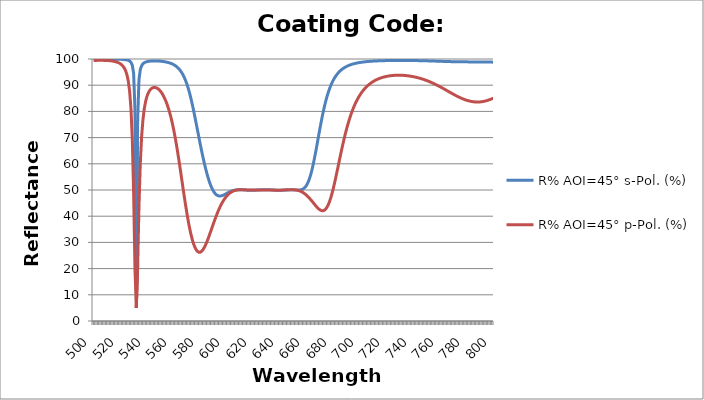
| Category | R% AOI=45° s-Pol. (%) | R% AOI=45° p-Pol. (%) |
|---|---|---|
| 500.0 | 99.98 | 99.407 |
| 501.0 | 99.98 | 99.441 |
| 502.0 | 99.98 | 99.465 |
| 503.0 | 99.98 | 99.482 |
| 504.0 | 99.98 | 99.492 |
| 505.0 | 99.98 | 99.496 |
| 506.0 | 99.979 | 99.494 |
| 507.0 | 99.978 | 99.486 |
| 508.0 | 99.977 | 99.472 |
| 509.0 | 99.976 | 99.451 |
| 510.0 | 99.974 | 99.423 |
| 511.0 | 99.972 | 99.387 |
| 512.0 | 99.969 | 99.341 |
| 513.0 | 99.966 | 99.284 |
| 514.0 | 99.962 | 99.212 |
| 515.0 | 99.957 | 99.125 |
| 516.0 | 99.95 | 99.015 |
| 517.0 | 99.943 | 98.878 |
| 518.0 | 99.933 | 98.703 |
| 519.0 | 99.92 | 98.478 |
| 520.0 | 99.904 | 98.183 |
| 521.0 | 99.881 | 97.793 |
| 522.0 | 99.85 | 97.262 |
| 523.0 | 99.807 | 96.526 |
| 524.0 | 99.744 | 95.472 |
| 525.0 | 99.648 | 93.913 |
| 526.0 | 99.494 | 91.51 |
| 527.0 | 99.229 | 87.63 |
| 528.0 | 98.724 | 81.036 |
| 529.0 | 97.606 | 69.329 |
| 530.0 | 94.458 | 48.786 |
| 531.0 | 80.641 | 20.008 |
| 532.0 | 15.789 | 4.939 |
| 533.0 | 76.487 | 20.531 |
| 534.0 | 92.083 | 43.625 |
| 535.0 | 95.959 | 60.15 |
| 536.0 | 97.449 | 70.452 |
| 537.0 | 98.175 | 76.892 |
| 538.0 | 98.581 | 81.054 |
| 539.0 | 98.83 | 83.834 |
| 540.0 | 98.991 | 85.737 |
| 541.0 | 99.098 | 87.055 |
| 542.0 | 99.17 | 87.963 |
| 543.0 | 99.218 | 88.568 |
| 544.0 | 99.247 | 88.94 |
| 545.0 | 99.262 | 89.122 |
| 546.0 | 99.265 | 89.141 |
| 547.0 | 99.256 | 89.013 |
| 548.0 | 99.238 | 88.747 |
| 549.0 | 99.209 | 88.345 |
| 550.0 | 99.169 | 87.805 |
| 551.0 | 99.118 | 87.119 |
| 552.0 | 99.054 | 86.279 |
| 553.0 | 98.976 | 85.271 |
| 554.0 | 98.886 | 84.141 |
| 555.0 | 98.78 | 82.847 |
| 556.0 | 98.654 | 81.359 |
| 557.0 | 98.503 | 79.661 |
| 558.0 | 98.324 | 77.739 |
| 559.0 | 98.11 | 75.581 |
| 560.0 | 97.855 | 73.183 |
| 561.0 | 97.55 | 70.544 |
| 562.0 | 97.187 | 67.674 |
| 563.0 | 96.753 | 64.594 |
| 564.0 | 96.234 | 61.336 |
| 565.0 | 95.616 | 57.944 |
| 566.0 | 94.881 | 54.472 |
| 567.0 | 94.009 | 50.983 |
| 568.0 | 92.982 | 47.542 |
| 569.0 | 91.779 | 44.215 |
| 570.0 | 90.384 | 41.063 |
| 571.0 | 88.784 | 38.139 |
| 572.0 | 86.974 | 35.488 |
| 573.0 | 84.959 | 33.143 |
| 574.0 | 82.753 | 31.126 |
| 575.0 | 80.384 | 29.454 |
| 576.0 | 77.887 | 28.133 |
| 577.0 | 75.305 | 27.163 |
| 578.0 | 72.684 | 26.539 |
| 579.0 | 70.068 | 26.25 |
| 580.0 | 67.495 | 26.278 |
| 581.0 | 65 | 26.602 |
| 582.0 | 62.611 | 27.193 |
| 583.0 | 60.349 | 28.021 |
| 584.0 | 58.234 | 29.049 |
| 585.0 | 56.284 | 30.239 |
| 586.0 | 54.513 | 31.553 |
| 587.0 | 52.938 | 32.953 |
| 588.0 | 51.568 | 34.403 |
| 589.0 | 50.413 | 35.869 |
| 590.0 | 49.475 | 37.324 |
| 591.0 | 48.751 | 38.742 |
| 592.0 | 48.231 | 40.103 |
| 593.0 | 47.898 | 41.391 |
| 594.0 | 47.731 | 42.594 |
| 595.0 | 47.704 | 43.705 |
| 596.0 | 47.791 | 44.718 |
| 597.0 | 47.963 | 45.631 |
| 598.0 | 48.194 | 46.443 |
| 599.0 | 48.46 | 47.158 |
| 600.0 | 48.74 | 47.778 |
| 601.0 | 49.017 | 48.308 |
| 602.0 | 49.274 | 48.752 |
| 603.0 | 49.494 | 49.114 |
| 604.0 | 49.681 | 49.406 |
| 605.0 | 49.832 | 49.636 |
| 606.0 | 49.948 | 49.811 |
| 607.0 | 50.029 | 49.938 |
| 608.0 | 50.078 | 50.024 |
| 609.0 | 50.099 | 50.077 |
| 610.0 | 50.098 | 50.104 |
| 611.0 | 50.079 | 50.11 |
| 612.0 | 50.048 | 50.102 |
| 613.0 | 50.012 | 50.084 |
| 614.0 | 49.975 | 50.061 |
| 615.0 | 49.941 | 50.038 |
| 616.0 | 49.913 | 50.015 |
| 617.0 | 49.895 | 49.997 |
| 618.0 | 49.887 | 49.983 |
| 619.0 | 49.89 | 49.975 |
| 620.0 | 49.902 | 49.972 |
| 621.0 | 49.923 | 49.974 |
| 622.0 | 49.951 | 49.979 |
| 623.0 | 49.982 | 49.987 |
| 624.0 | 50.014 | 49.996 |
| 625.0 | 50.045 | 50.005 |
| 626.0 | 50.071 | 50.012 |
| 627.0 | 50.092 | 50.017 |
| 628.0 | 50.105 | 50.018 |
| 629.0 | 50.109 | 50.016 |
| 630.0 | 50.105 | 50.009 |
| 631.0 | 50.093 | 49.999 |
| 632.0 | 50.074 | 49.987 |
| 633.0 | 50.05 | 49.974 |
| 634.0 | 50.023 | 49.96 |
| 635.0 | 49.995 | 49.947 |
| 636.0 | 49.969 | 49.936 |
| 637.0 | 49.946 | 49.928 |
| 638.0 | 49.93 | 49.925 |
| 639.0 | 49.92 | 49.928 |
| 640.0 | 49.918 | 49.937 |
| 641.0 | 49.926 | 49.953 |
| 642.0 | 49.94 | 49.975 |
| 643.0 | 49.961 | 50.002 |
| 644.0 | 49.985 | 50.032 |
| 645.0 | 50.01 | 50.064 |
| 646.0 | 50.033 | 50.094 |
| 647.0 | 50.05 | 50.119 |
| 648.0 | 50.059 | 50.135 |
| 649.0 | 50.057 | 50.137 |
| 650.0 | 50.044 | 50.12 |
| 651.0 | 50.024 | 50.08 |
| 652.0 | 49.999 | 50.012 |
| 653.0 | 49.981 | 49.908 |
| 654.0 | 49.982 | 49.766 |
| 655.0 | 50.023 | 49.581 |
| 656.0 | 50.131 | 49.347 |
| 657.0 | 50.338 | 49.063 |
| 658.0 | 50.685 | 48.724 |
| 659.0 | 51.216 | 48.33 |
| 660.0 | 51.977 | 47.881 |
| 661.0 | 53.014 | 47.379 |
| 662.0 | 54.347 | 46.841 |
| 663.0 | 56 | 46.267 |
| 664.0 | 57.976 | 45.661 |
| 665.0 | 60.251 | 45.038 |
| 666.0 | 62.777 | 44.412 |
| 667.0 | 65.487 | 43.806 |
| 668.0 | 68.303 | 43.243 |
| 669.0 | 71.142 | 42.754 |
| 670.0 | 73.928 | 42.372 |
| 671.0 | 76.599 | 42.132 |
| 672.0 | 79.106 | 42.071 |
| 673.0 | 81.419 | 42.225 |
| 674.0 | 83.522 | 42.626 |
| 675.0 | 85.412 | 43.3 |
| 676.0 | 87.096 | 44.263 |
| 677.0 | 88.584 | 45.516 |
| 678.0 | 89.894 | 47.052 |
| 679.0 | 91.041 | 48.846 |
| 680.0 | 92.044 | 50.865 |
| 681.0 | 92.921 | 53.065 |
| 682.0 | 93.685 | 55.396 |
| 683.0 | 94.352 | 57.808 |
| 684.0 | 94.935 | 60.251 |
| 685.0 | 95.445 | 62.682 |
| 686.0 | 95.892 | 65.062 |
| 687.0 | 96.283 | 67.362 |
| 688.0 | 96.627 | 69.558 |
| 689.0 | 96.93 | 71.635 |
| 690.0 | 97.198 | 73.582 |
| 691.0 | 97.434 | 75.396 |
| 692.0 | 97.644 | 77.077 |
| 693.0 | 97.83 | 78.627 |
| 694.0 | 97.996 | 80.052 |
| 695.0 | 98.144 | 81.357 |
| 696.0 | 98.276 | 82.551 |
| 697.0 | 98.394 | 83.641 |
| 698.0 | 98.5 | 84.634 |
| 699.0 | 98.596 | 85.54 |
| 700.0 | 98.681 | 86.364 |
| 701.0 | 98.759 | 87.115 |
| 702.0 | 98.829 | 87.798 |
| 703.0 | 98.892 | 88.419 |
| 704.0 | 98.95 | 88.985 |
| 705.0 | 99.002 | 89.5 |
| 706.0 | 99.049 | 89.969 |
| 707.0 | 99.092 | 90.396 |
| 708.0 | 99.13 | 90.784 |
| 709.0 | 99.166 | 91.137 |
| 710.0 | 99.198 | 91.458 |
| 711.0 | 99.228 | 91.749 |
| 712.0 | 99.254 | 92.014 |
| 713.0 | 99.278 | 92.254 |
| 714.0 | 99.3 | 92.471 |
| 715.0 | 99.32 | 92.667 |
| 716.0 | 99.338 | 92.843 |
| 717.0 | 99.355 | 93.002 |
| 718.0 | 99.369 | 93.143 |
| 719.0 | 99.383 | 93.268 |
| 720.0 | 99.394 | 93.378 |
| 721.0 | 99.405 | 93.475 |
| 722.0 | 99.414 | 93.558 |
| 723.0 | 99.422 | 93.628 |
| 724.0 | 99.429 | 93.687 |
| 725.0 | 99.434 | 93.734 |
| 726.0 | 99.439 | 93.77 |
| 727.0 | 99.443 | 93.795 |
| 728.0 | 99.446 | 93.81 |
| 729.0 | 99.448 | 93.815 |
| 730.0 | 99.449 | 93.81 |
| 731.0 | 99.449 | 93.795 |
| 732.0 | 99.448 | 93.771 |
| 733.0 | 99.446 | 93.737 |
| 734.0 | 99.444 | 93.694 |
| 735.0 | 99.44 | 93.64 |
| 736.0 | 99.436 | 93.577 |
| 737.0 | 99.43 | 93.505 |
| 738.0 | 99.425 | 93.426 |
| 739.0 | 99.418 | 93.338 |
| 740.0 | 99.411 | 93.242 |
| 741.0 | 99.403 | 93.136 |
| 742.0 | 99.394 | 93.022 |
| 743.0 | 99.384 | 92.898 |
| 744.0 | 99.374 | 92.766 |
| 745.0 | 99.363 | 92.623 |
| 746.0 | 99.351 | 92.472 |
| 747.0 | 99.339 | 92.311 |
| 748.0 | 99.326 | 92.141 |
| 749.0 | 99.312 | 91.961 |
| 750.0 | 99.297 | 91.772 |
| 751.0 | 99.282 | 91.574 |
| 752.0 | 99.266 | 91.367 |
| 753.0 | 99.25 | 91.15 |
| 754.0 | 99.233 | 90.925 |
| 755.0 | 99.216 | 90.692 |
| 756.0 | 99.199 | 90.45 |
| 757.0 | 99.181 | 90.2 |
| 758.0 | 99.163 | 89.943 |
| 759.0 | 99.145 | 89.679 |
| 760.0 | 99.128 | 89.408 |
| 761.0 | 99.11 | 89.133 |
| 762.0 | 99.092 | 88.852 |
| 763.0 | 99.075 | 88.568 |
| 764.0 | 99.058 | 88.281 |
| 765.0 | 99.042 | 87.992 |
| 766.0 | 99.027 | 87.702 |
| 767.0 | 99.012 | 87.412 |
| 768.0 | 98.999 | 87.124 |
| 769.0 | 98.986 | 86.839 |
| 770.0 | 98.974 | 86.558 |
| 771.0 | 98.963 | 86.282 |
| 772.0 | 98.953 | 86.012 |
| 773.0 | 98.944 | 85.751 |
| 774.0 | 98.936 | 85.5 |
| 775.0 | 98.928 | 85.258 |
| 776.0 | 98.922 | 85.029 |
| 777.0 | 98.917 | 84.813 |
| 778.0 | 98.912 | 84.611 |
| 779.0 | 98.908 | 84.424 |
| 780.0 | 98.905 | 84.254 |
| 781.0 | 98.902 | 84.101 |
| 782.0 | 98.899 | 83.967 |
| 783.0 | 98.896 | 83.851 |
| 784.0 | 98.894 | 83.755 |
| 785.0 | 98.892 | 83.68 |
| 786.0 | 98.89 | 83.625 |
| 787.0 | 98.887 | 83.592 |
| 788.0 | 98.884 | 83.58 |
| 789.0 | 98.881 | 83.59 |
| 790.0 | 98.877 | 83.622 |
| 791.0 | 98.872 | 83.675 |
| 792.0 | 98.867 | 83.75 |
| 793.0 | 98.862 | 83.846 |
| 794.0 | 98.855 | 83.963 |
| 795.0 | 98.848 | 84.1 |
| 796.0 | 98.839 | 84.257 |
| 797.0 | 98.83 | 84.432 |
| 798.0 | 98.819 | 84.625 |
| 799.0 | 98.807 | 84.834 |
| 800.0 | 98.794 | 85.059 |